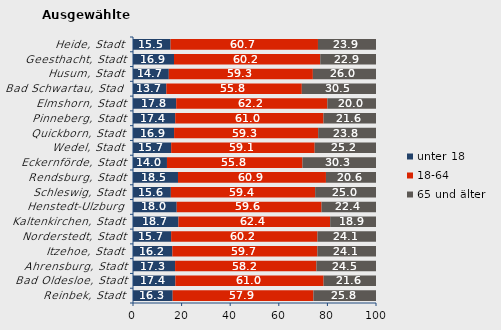
| Category | unter 18 | 18-64 | 65 und älter |
|---|---|---|---|
| Reinbek, Stadt | 16.333 | 57.911 | 25.757 |
| Bad Oldesloe, Stadt | 17.448 | 60.988 | 21.563 |
| Ahrensburg, Stadt | 17.321 | 58.15 | 24.529 |
| Itzehoe, Stadt | 16.193 | 59.683 | 24.124 |
| Norderstedt, Stadt | 15.691 | 60.218 | 24.091 |
| Kaltenkirchen, Stadt | 18.698 | 62.445 | 18.857 |
| Henstedt-Ulzburg | 17.994 | 59.596 | 22.41 |
| Schleswig, Stadt | 15.577 | 59.38 | 25.043 |
| Rendsburg, Stadt | 18.515 | 60.891 | 20.595 |
| Eckernförde, Stadt | 13.977 | 55.762 | 30.26 |
| Wedel, Stadt | 15.705 | 59.063 | 25.231 |
| Quickborn, Stadt | 16.91 | 59.289 | 23.801 |
| Pinneberg, Stadt | 17.372 | 61.028 | 21.6 |
| Elmshorn, Stadt | 17.778 | 62.205 | 20.017 |
| Bad Schwartau, Stadt | 13.715 | 55.757 | 30.528 |
| Husum, Stadt | 14.735 | 59.287 | 25.978 |
| Geesthacht, Stadt | 16.873 | 60.193 | 22.934 |
| Heide, Stadt | 15.459 | 60.663 | 23.879 |